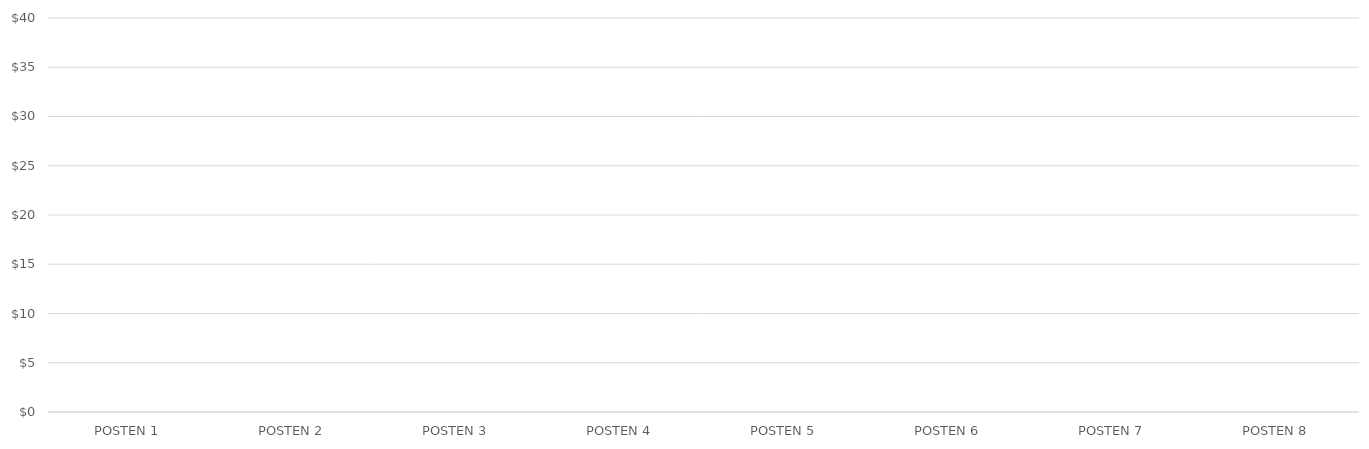
| Category | GEWINN PRO ELEMENT |
|---|---|
| POSTEN 1 | 0 |
| POSTEN 2 | 0 |
| POSTEN 3 | 0 |
| POSTEN 4 | 0 |
| POSTEN 5 | 0 |
| POSTEN 6 | 0 |
| POSTEN 7 | 0 |
| POSTEN 8 | 0 |